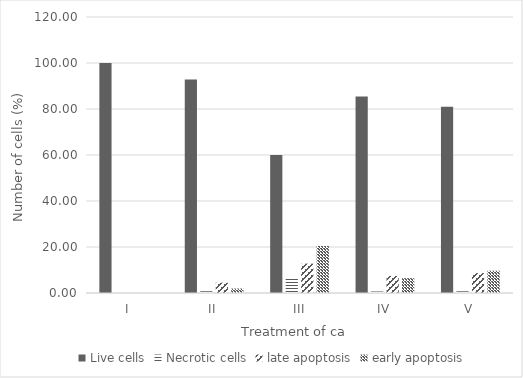
| Category | Live cells | Necrotic cells | late apoptosis | early apoptosis |
|---|---|---|---|---|
| I | 100 | 0 | 0 | 0 |
| II | 92.823 | 0.767 | 4.48 | 1.927 |
| III | 60.043 | 6.753 | 12.76 | 20.443 |
| IV | 85.48 | 0.657 | 7.413 | 6.453 |
| V | 80.933 | 0.74 | 8.657 | 9.673 |